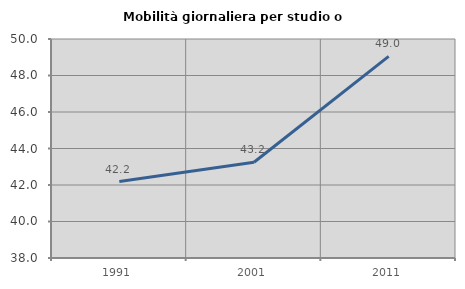
| Category | Mobilità giornaliera per studio o lavoro |
|---|---|
| 1991.0 | 42.188 |
| 2001.0 | 43.246 |
| 2011.0 | 49.049 |